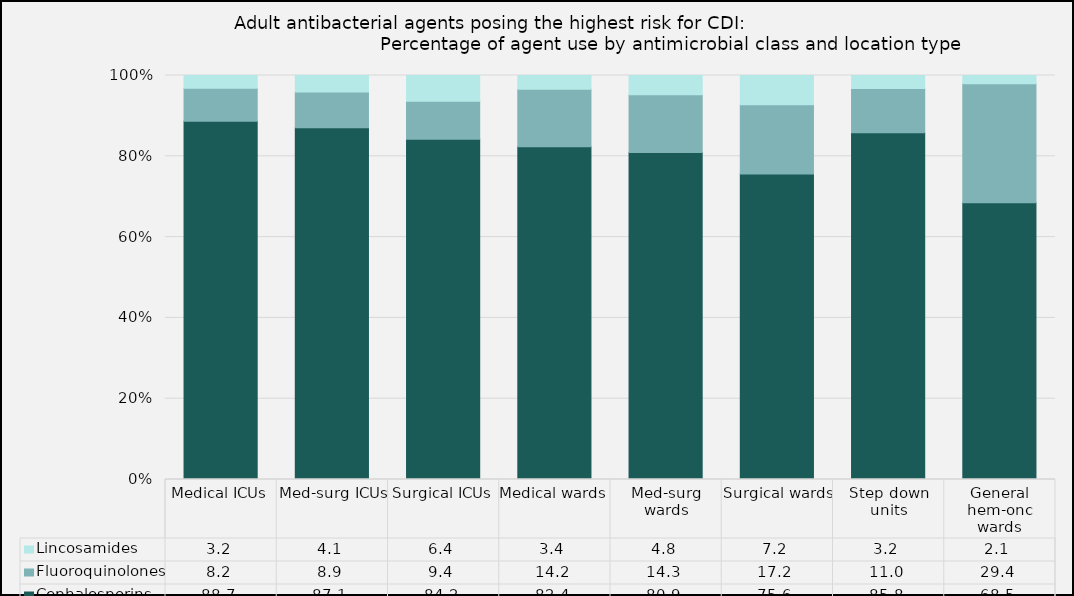
| Category | Cephalosporins | Fluoroquinolones | Lincosamides |
|---|---|---|---|
| Medical ICUs | 88.67 | 8.17 | 3.17 |
| Med-surg ICUs | 87.07 | 8.87 | 4.06 |
| Surgical ICUs | 84.21 | 9.44 | 6.35 |
| Medical wards | 82.36 | 14.22 | 3.41 |
| Med-surg wards | 80.91 | 14.32 | 4.77 |
| Surgical wards | 75.6 | 17.16 | 7.24 |
| Step down units | 85.8 | 10.99 | 3.21 |
| General hem-onc wards | 68.53 | 29.4 | 2.07 |